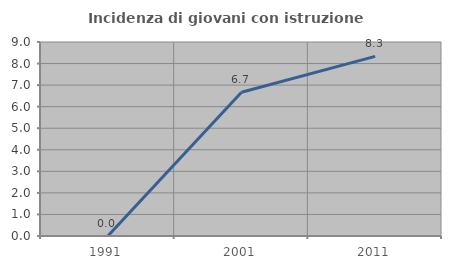
| Category | Incidenza di giovani con istruzione universitaria |
|---|---|
| 1991.0 | 0 |
| 2001.0 | 6.667 |
| 2011.0 | 8.333 |